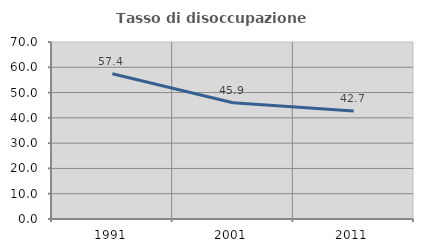
| Category | Tasso di disoccupazione giovanile  |
|---|---|
| 1991.0 | 57.411 |
| 2001.0 | 45.95 |
| 2011.0 | 42.747 |